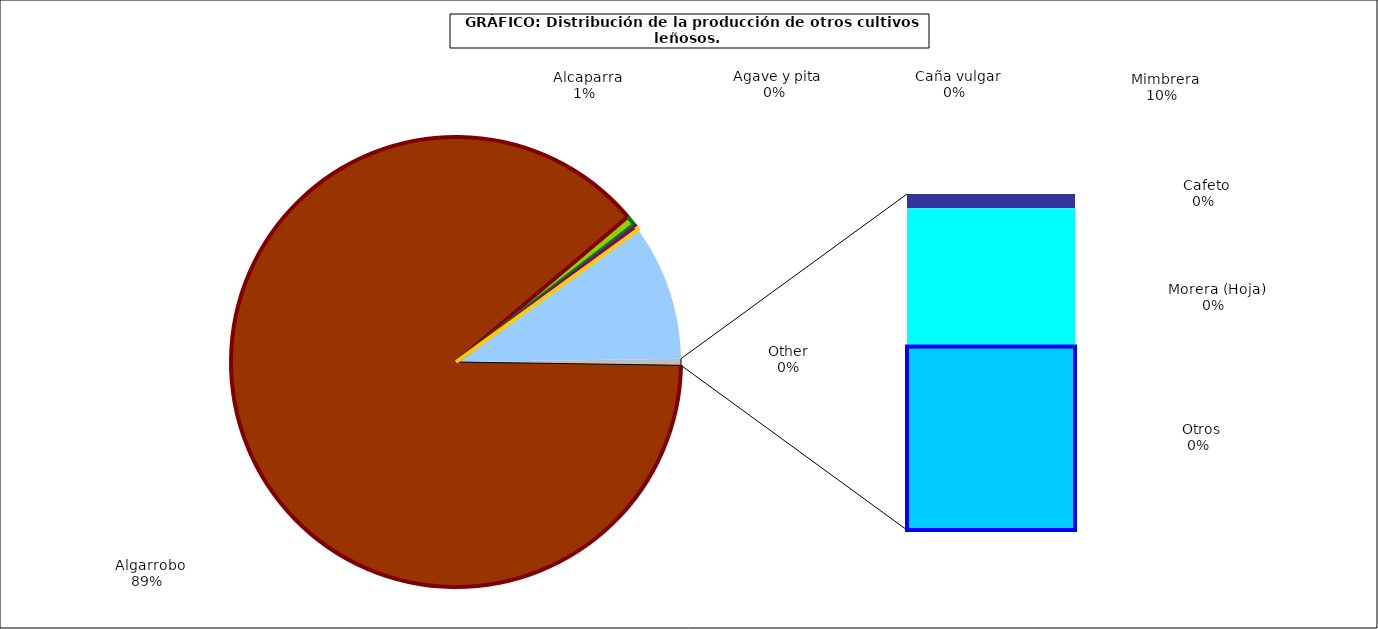
| Category | Series 0 |
|---|---|
|   Algarrobo | 53477 |
|   Alcaparra | 424 |
|   Agave y pita | 127 |
|   Caña vulgar | 147 |
|   Mimbrera | 5904 |
|   Cafeto | 12 |
|   Morera (Hoja) | 116 |
|   Otros | 154 |